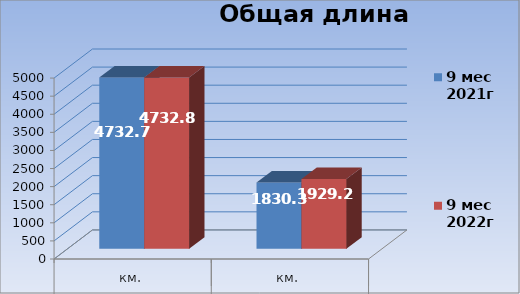
| Category | 9 мес 2021г | 9 мес 2022г |
|---|---|---|
| 0 | 4732.7 | 4732.8 |
| 1 | 1830.3 | 1929.21 |